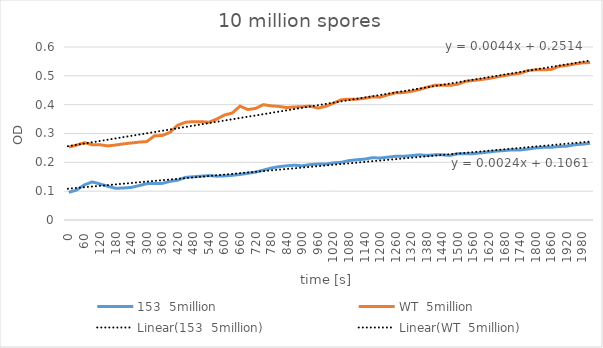
| Category | 153  5million | WT  5million |
|---|---|---|
| 0.0 | 0.096 | 0.253 |
| 30.0 | 0.104 | 0.26 |
| 60.0 | 0.122 | 0.268 |
| 90.0 | 0.132 | 0.261 |
| 120.0 | 0.125 | 0.261 |
| 150.0 | 0.117 | 0.257 |
| 180.0 | 0.11 | 0.26 |
| 210.0 | 0.111 | 0.264 |
| 240.0 | 0.113 | 0.267 |
| 270.0 | 0.119 | 0.27 |
| 300.0 | 0.126 | 0.272 |
| 330.0 | 0.127 | 0.292 |
| 360.0 | 0.127 | 0.293 |
| 390.0 | 0.134 | 0.304 |
| 420.0 | 0.138 | 0.329 |
| 450.0 | 0.148 | 0.339 |
| 480.0 | 0.15 | 0.341 |
| 510.0 | 0.152 | 0.341 |
| 540.0 | 0.154 | 0.339 |
| 570.0 | 0.152 | 0.35 |
| 600.0 | 0.153 | 0.364 |
| 630.0 | 0.155 | 0.371 |
| 660.0 | 0.158 | 0.395 |
| 690.0 | 0.162 | 0.383 |
| 720.0 | 0.166 | 0.387 |
| 750.0 | 0.173 | 0.4 |
| 780.0 | 0.18 | 0.396 |
| 810.0 | 0.185 | 0.394 |
| 840.0 | 0.188 | 0.39 |
| 870.0 | 0.19 | 0.392 |
| 900.0 | 0.188 | 0.393 |
| 930.0 | 0.192 | 0.395 |
| 960.0 | 0.194 | 0.388 |
| 990.0 | 0.194 | 0.394 |
| 1020.0 | 0.198 | 0.405 |
| 1050.0 | 0.2 | 0.417 |
| 1080.0 | 0.206 | 0.419 |
| 1110.0 | 0.209 | 0.419 |
| 1140.0 | 0.211 | 0.422 |
| 1170.0 | 0.216 | 0.427 |
| 1200.0 | 0.215 | 0.426 |
| 1230.0 | 0.218 | 0.434 |
| 1260.0 | 0.221 | 0.441 |
| 1290.0 | 0.221 | 0.442 |
| 1320.0 | 0.223 | 0.446 |
| 1350.0 | 0.226 | 0.452 |
| 1380.0 | 0.224 | 0.46 |
| 1410.0 | 0.226 | 0.467 |
| 1440.0 | 0.226 | 0.467 |
| 1470.0 | 0.224 | 0.467 |
| 1500.0 | 0.23 | 0.471 |
| 1530.0 | 0.23 | 0.481 |
| 1560.0 | 0.23 | 0.484 |
| 1590.0 | 0.233 | 0.487 |
| 1620.0 | 0.236 | 0.491 |
| 1650.0 | 0.239 | 0.496 |
| 1680.0 | 0.241 | 0.501 |
| 1710.0 | 0.243 | 0.505 |
| 1740.0 | 0.243 | 0.509 |
| 1770.0 | 0.246 | 0.518 |
| 1800.0 | 0.25 | 0.521 |
| 1830.0 | 0.252 | 0.521 |
| 1860.0 | 0.252 | 0.522 |
| 1890.0 | 0.255 | 0.533 |
| 1920.0 | 0.256 | 0.536 |
| 1950.0 | 0.261 | 0.541 |
| 1980.0 | 0.263 | 0.545 |
| 2010.0 | 0.266 | 0.546 |